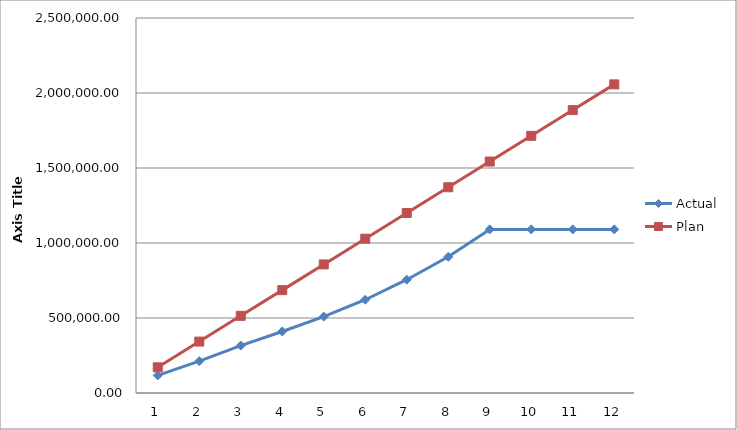
| Category | Actual | Plan |
|---|---|---|
| 0 | 117235.73 | 171454.667 |
| 1 | 212569.21 | 342909.333 |
| 2 | 316380.09 | 514364 |
| 3 | 410155.29 | 685818.667 |
| 4 | 509580.85 | 857273.333 |
| 5 | 621706 | 1028728 |
| 6 | 755266.59 | 1200182.667 |
| 7 | 907777.96 | 1371637.333 |
| 8 | 1090747.98 | 1543092 |
| 9 | 1090747.98 | 1714546.667 |
| 10 | 1090747.98 | 1886001.333 |
| 11 | 1090747.98 | 2057456 |